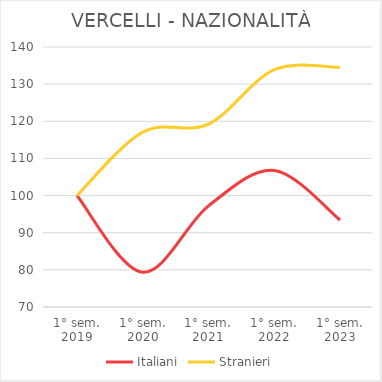
| Category | Italiani | Stranieri |
|---|---|---|
| 1° sem.
2019 | 100 | 100 |
| 1° sem.
2020 | 79.336 | 117.073 |
| 1° sem.
2021 | 97.223 | 119.255 |
| 1° sem.
2022 | 106.752 | 133.89 |
| 1° sem.
2023 | 93.411 | 134.531 |